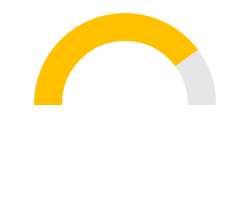
| Category | Series 0 |
|---|---|
| 0 | 0.4 |
| 1 | 0.1 |
| 2 | 0.5 |